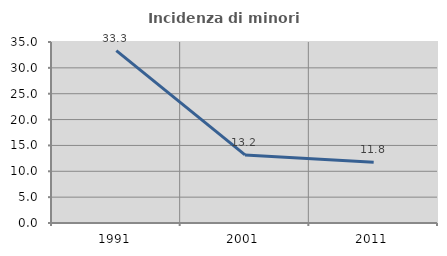
| Category | Incidenza di minori stranieri |
|---|---|
| 1991.0 | 33.333 |
| 2001.0 | 13.158 |
| 2011.0 | 11.765 |